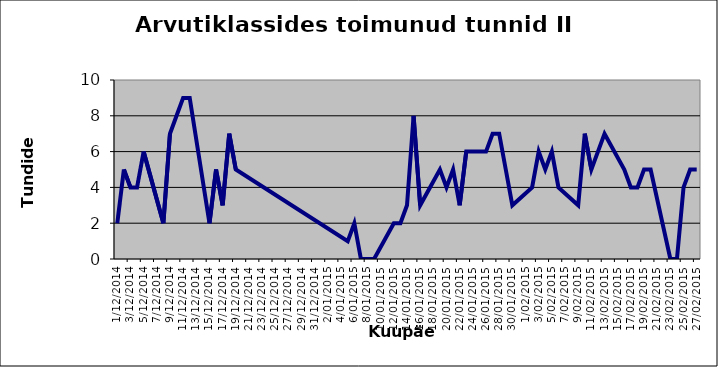
| Category | Series 0 |
|---|---|
| 2014-12-01 | 2 |
| 2014-12-02 | 5 |
| 2014-12-03 | 4 |
| 2014-12-04 | 4 |
| 2014-12-05 | 6 |
| 2014-12-08 | 2 |
| 2014-12-09 | 7 |
| 2014-12-10 | 8 |
| 2014-12-11 | 9 |
| 2014-12-12 | 9 |
| 2014-12-15 | 2 |
| 2014-12-16 | 5 |
| 2014-12-17 | 3 |
| 2014-12-18 | 7 |
| 2014-12-19 | 5 |
| 2015-01-05 | 1 |
| 2015-01-06 | 2 |
| 2015-01-07 | 0 |
| 2015-01-08 | 0 |
| 2015-01-09 | 0 |
| 2015-01-12 | 2 |
| 2015-01-13 | 2 |
| 2015-01-14 | 3 |
| 2015-01-15 | 8 |
| 2015-01-16 | 3 |
| 2015-01-19 | 5 |
| 2015-01-20 | 4 |
| 2015-01-21 | 5 |
| 2015-01-22 | 3 |
| 2015-01-23 | 6 |
| 2015-01-26 | 6 |
| 2015-01-27 | 7 |
| 2015-01-28 | 7 |
| 2015-01-29 | 5 |
| 2015-01-30 | 3 |
| 2015-02-02 | 4 |
| 2015-02-03 | 6 |
| 2015-02-04 | 5 |
| 2015-02-05 | 6 |
| 2015-02-06 | 4 |
| 2015-02-09 | 3 |
| 2015-02-10 | 7 |
| 2015-02-11 | 5 |
| 2015-02-12 | 6 |
| 2015-02-13 | 7 |
| 2015-02-16 | 5 |
| 2015-02-17 | 4 |
| 2015-02-18 | 4 |
| 2015-02-19 | 5 |
| 2015-02-20 | 5 |
| 2015-02-23 | 0 |
| 2015-02-24 | 0 |
| 2015-02-25 | 4 |
| 2015-02-26 | 5 |
| 2015-02-27 | 5 |